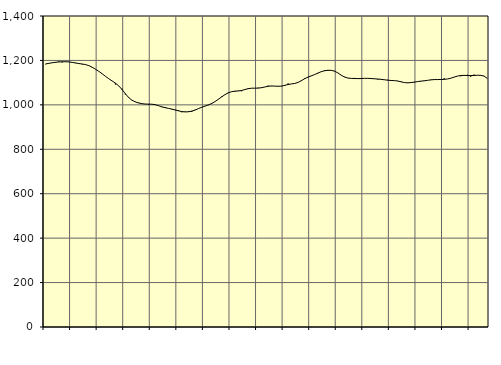
| Category | Piggar | Series 1 |
|---|---|---|
| nan | 1182.7 | 1184.3 |
| 87.0 | 1187.1 | 1186.91 |
| 87.0 | 1188.6 | 1189.51 |
| 87.0 | 1190 | 1191.73 |
| nan | 1195.5 | 1193.1 |
| 88.0 | 1191 | 1193.93 |
| 88.0 | 1195.1 | 1194.16 |
| 88.0 | 1194.6 | 1193.26 |
| nan | 1190.3 | 1191.18 |
| 89.0 | 1189.7 | 1188.4 |
| 89.0 | 1187.2 | 1185.95 |
| 89.0 | 1182.1 | 1183.97 |
| nan | 1182.1 | 1181.3 |
| 90.0 | 1178 | 1176.63 |
| 90.0 | 1167.8 | 1169.41 |
| 90.0 | 1160.9 | 1160.57 |
| nan | 1151.1 | 1150.93 |
| 91.0 | 1140.4 | 1140.17 |
| 91.0 | 1128.3 | 1128.62 |
| 91.0 | 1117.7 | 1117.67 |
| nan | 1107.9 | 1107.63 |
| 92.0 | 1091.7 | 1097.76 |
| 92.0 | 1085.5 | 1085.55 |
| 92.0 | 1072.7 | 1069.04 |
| nan | 1046.5 | 1050.15 |
| 93.0 | 1031.4 | 1032.95 |
| 93.0 | 1021.9 | 1020.77 |
| 93.0 | 1014.2 | 1013.25 |
| nan | 1009.7 | 1008.35 |
| 94.0 | 1005.3 | 1005.34 |
| 94.0 | 1003.9 | 1003.71 |
| 94.0 | 1000.7 | 1003.3 |
| nan | 1002.6 | 1002.94 |
| 95.0 | 1001.9 | 1000.74 |
| 95.0 | 995.6 | 996.22 |
| 95.0 | 989.8 | 991.1 |
| nan | 990.3 | 987.2 |
| 96.0 | 984.4 | 984.09 |
| 96.0 | 979.5 | 980.89 |
| 96.0 | 976.2 | 977.15 |
| nan | 975.5 | 973.08 |
| 97.0 | 966.6 | 969.76 |
| 97.0 | 969.9 | 968.24 |
| 97.0 | 971 | 968.88 |
| nan | 968 | 971.73 |
| 98.0 | 978 | 976.62 |
| 98.0 | 982.7 | 983.06 |
| 98.0 | 988.5 | 989.1 |
| nan | 994.9 | 994.37 |
| 99.0 | 998.6 | 999.72 |
| 99.0 | 1004.2 | 1006.1 |
| 99.0 | 1014.6 | 1014.71 |
| nan | 1025.8 | 1025.08 |
| 0.0 | 1038.1 | 1035.8 |
| 0.0 | 1045.5 | 1046.03 |
| 0.0 | 1055.7 | 1054.19 |
| nan | 1059.8 | 1059.46 |
| 1.0 | 1059.5 | 1061.69 |
| 1.0 | 1063.8 | 1062.46 |
| 1.0 | 1061.3 | 1064.74 |
| nan | 1069.3 | 1068.95 |
| 2.0 | 1075.1 | 1072.89 |
| 2.0 | 1074.7 | 1074.9 |
| 2.0 | 1075.2 | 1075.07 |
| nan | 1077.1 | 1075.33 |
| 3.0 | 1075.8 | 1077.33 |
| 3.0 | 1080.2 | 1080.51 |
| 3.0 | 1086.6 | 1083.68 |
| nan | 1084.2 | 1085.03 |
| 4.0 | 1084.2 | 1084.39 |
| 4.0 | 1083.2 | 1083.67 |
| 4.0 | 1083.6 | 1084.53 |
| nan | 1084.9 | 1087.72 |
| 5.0 | 1096.6 | 1091.55 |
| 5.0 | 1094.6 | 1094.23 |
| 5.0 | 1095.6 | 1096.4 |
| nan | 1100.4 | 1100.92 |
| 6.0 | 1107.1 | 1109 |
| 6.0 | 1120 | 1117.81 |
| 6.0 | 1123.6 | 1124.95 |
| nan | 1129.6 | 1130.61 |
| 7.0 | 1137.1 | 1136.42 |
| 7.0 | 1142.4 | 1143.25 |
| 7.0 | 1150.5 | 1149.44 |
| nan | 1156.5 | 1153.62 |
| 8.0 | 1153.1 | 1155.58 |
| 8.0 | 1156.1 | 1155.31 |
| 8.0 | 1152.8 | 1151.64 |
| nan | 1143.5 | 1143.81 |
| 9.0 | 1134.2 | 1133.49 |
| 9.0 | 1126.5 | 1125.25 |
| 9.0 | 1120.4 | 1120.73 |
| nan | 1119.2 | 1119.13 |
| 10.0 | 1121.2 | 1118.52 |
| 10.0 | 1116.4 | 1118.18 |
| 10.0 | 1117.8 | 1118.57 |
| nan | 1119.7 | 1119.34 |
| 11.0 | 1119.5 | 1119.33 |
| 11.0 | 1119.6 | 1118.42 |
| 11.0 | 1116.4 | 1117.44 |
| nan | 1114.1 | 1116.38 |
| 12.0 | 1114.2 | 1114.8 |
| 12.0 | 1112.2 | 1112.93 |
| 12.0 | 1112.9 | 1111.04 |
| nan | 1108.9 | 1109.79 |
| 13.0 | 1108.9 | 1109.09 |
| 13.0 | 1108 | 1107.31 |
| 13.0 | 1105 | 1103.8 |
| nan | 1100.5 | 1100.35 |
| 14.0 | 1098.2 | 1099.12 |
| 14.0 | 1101.2 | 1100.28 |
| 14.0 | 1100.3 | 1102.49 |
| nan | 1104.6 | 1104.77 |
| 15.0 | 1107.5 | 1106.69 |
| 15.0 | 1107.4 | 1108.44 |
| 15.0 | 1110.7 | 1110.39 |
| nan | 1111.6 | 1112.62 |
| 16.0 | 1114.8 | 1113.74 |
| 16.0 | 1114.4 | 1113.92 |
| 16.0 | 1112.1 | 1114.22 |
| nan | 1119.3 | 1114.87 |
| 17.0 | 1116.5 | 1116.49 |
| 17.0 | 1120.1 | 1119.92 |
| 17.0 | 1124.6 | 1124.97 |
| nan | 1129.3 | 1129.55 |
| 18.0 | 1128.7 | 1132.18 |
| 18.0 | 1130.7 | 1132.66 |
| 18.0 | 1135.4 | 1132.08 |
| nan | 1126.6 | 1131.86 |
| 19.0 | 1136.3 | 1132.49 |
| 19.0 | 1133.8 | 1133.22 |
| 19.0 | 1133.9 | 1132.82 |
| nan | 1130.3 | 1129.56 |
| 20.0 | 1118.4 | 1118.79 |